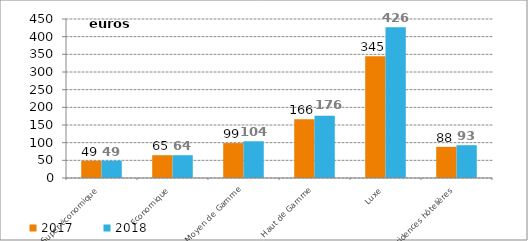
| Category | 2017 | 2018 |
|---|---|---|
| Super-économique | 48.775 | 48.959 |
| Economique | 64.539 | 64.469 |
| Moyen de Gamme | 98.759 | 103.92 |
| Haut de Gamme | 165.978 | 176.35 |
| Luxe | 344.784 | 426.399 |
| Résidences hôtelières | 88.182 | 92.84 |